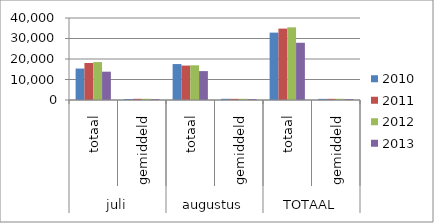
| Category | 2010 | 2011 | 2012 | 2013 |
|---|---|---|---|---|
| 0 | 15336 | 18039 | 18497 | 13816 |
| 1 | 495 | 582 | 596 | 446 |
| 2 | 17531 | 16789 | 16938 | 14097 |
| 3 | 584 | 560 | 565 | 470 |
| 4 | 32867 | 34828 | 35435 | 27913 |
| 5 | 539.5 | 571 | 580.5 | 458 |